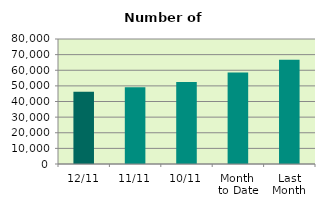
| Category | Series 0 |
|---|---|
| 12/11 | 46302 |
| 11/11 | 49150 |
| 10/11 | 52544 |
| Month 
to Date | 58638.8 |
| Last
Month | 66688.857 |